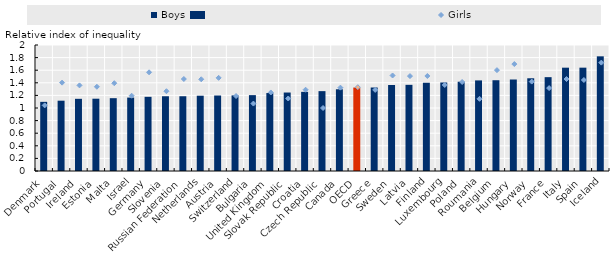
| Category | Boys |
|---|---|
| Denmark | 1.098 |
| Portugal | 1.116 |
| Ireland | 1.146 |
| Estonia | 1.148 |
| Malta | 1.156 |
| Israel | 1.165 |
| Germany | 1.178 |
| Slovenia | 1.187 |
| Russian Federation | 1.187 |
| Netherlands | 1.195 |
| Austria | 1.198 |
| Switzerland | 1.2 |
| Bulgaria | 1.204 |
| United Kingdom | 1.237 |
| Slovak Republic | 1.246 |
| Croatia | 1.256 |
| Czech Republic | 1.268 |
| Canada | 1.297 |
| OECD | 1.325 |
| Greece | 1.325 |
| Sweden | 1.365 |
| Latvia | 1.368 |
| Finland | 1.401 |
| Luxembourg | 1.405 |
| Poland | 1.417 |
| Roumania | 1.438 |
| Belgium | 1.441 |
| Hungary | 1.452 |
| Norway | 1.472 |
| France | 1.49 |
| Italy | 1.64 |
| Spain | 1.64 |
| Iceland | 1.82 |